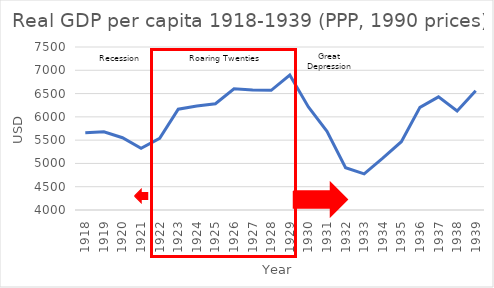
| Category | Series 0 |
|---|---|
| 1918.0 | 5658.984 |
| 1919.0 | 5680.406 |
| 1920.0 | 5552.327 |
| 1921.0 | 5322.734 |
| 1922.0 | 5539.844 |
| 1923.0 | 6164.199 |
| 1924.0 | 6232.551 |
| 1925.0 | 6282.419 |
| 1926.0 | 6602.442 |
| 1927.0 | 6576.499 |
| 1928.0 | 6569.345 |
| 1929.0 | 6898.722 |
| 1930.0 | 6212.713 |
| 1931.0 | 5691.367 |
| 1932.0 | 4908.366 |
| 1933.0 | 4776.915 |
| 1934.0 | 5113.608 |
| 1935.0 | 5466.838 |
| 1936.0 | 6203.884 |
| 1937.0 | 6430.121 |
| 1938.0 | 6126.466 |
| 1939.0 | 6560.753 |